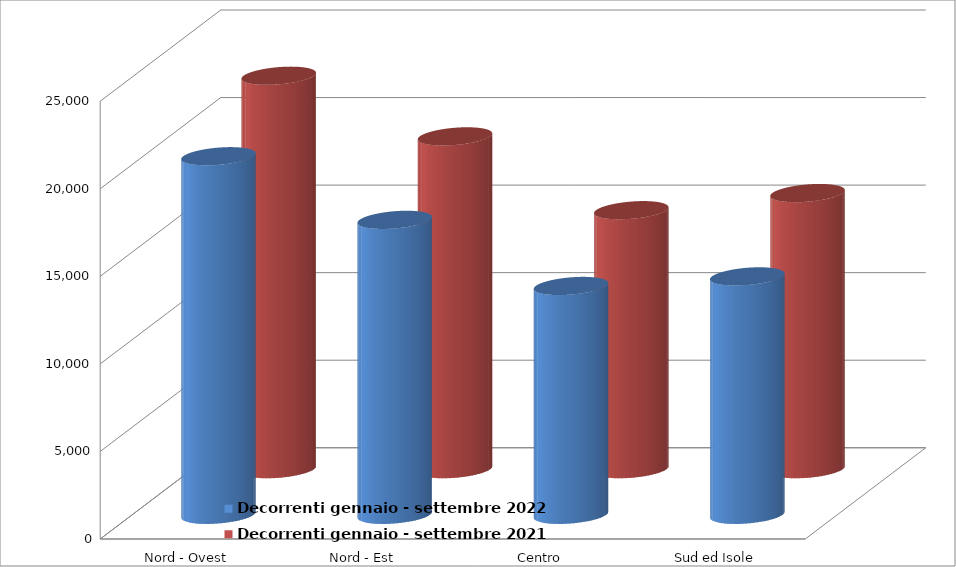
| Category | Decorrenti gennaio - settembre 2022 | Decorrenti gennaio - settembre 2021 |
|---|---|---|
| Nord - Ovest | 20478 | 22469 |
| Nord - Est | 16845 | 19007 |
| Centro | 13069 | 14791 |
| Sud ed Isole | 13616 | 15770 |